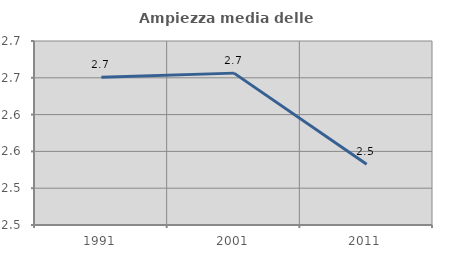
| Category | Ampiezza media delle famiglie |
|---|---|
| 1991.0 | 2.651 |
| 2001.0 | 2.656 |
| 2011.0 | 2.533 |